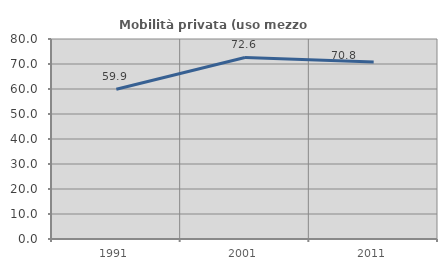
| Category | Mobilità privata (uso mezzo privato) |
|---|---|
| 1991.0 | 59.887 |
| 2001.0 | 72.6 |
| 2011.0 | 70.77 |